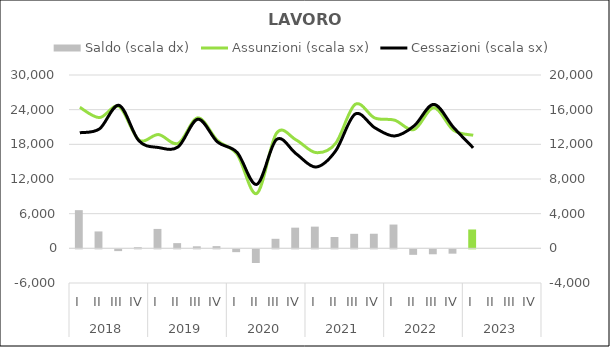
| Category | Saldo (scala dx) |
|---|---|
| 0 | 4405 |
| 1 | 1950 |
| 2 | -205 |
| 3 | 130 |
| 4 | 2240 |
| 5 | 600 |
| 6 | 235 |
| 7 | 255 |
| 8 | -325 |
| 9 | -1580 |
| 10 | 1100 |
| 11 | 2385 |
| 12 | 2505 |
| 13 | 1305 |
| 14 | 1675 |
| 15 | 1685 |
| 16 | 2745 |
| 17 | -635 |
| 18 | -570 |
| 19 | -500 |
| 20 | 2175 |
| 21 | 0 |
| 22 | 0 |
| 23 | 0 |